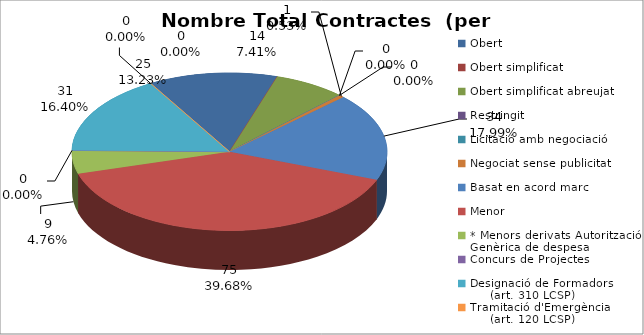
| Category | Nombre Total Contractes |
|---|---|
| Obert | 25 |
| Obert simplificat | 0 |
| Obert simplificat abreujat | 14 |
| Restringit | 0 |
| Licitació amb negociació | 0 |
| Negociat sense publicitat | 1 |
| Basat en acord marc | 34 |
| Menor | 75 |
| * Menors derivats Autorització Genèrica de despesa | 9 |
| Concurs de Projectes | 0 |
| Designació de Formadors
     (art. 310 LCSP) | 31 |
| Tramitació d'Emergència
     (art. 120 LCSP) | 0 |